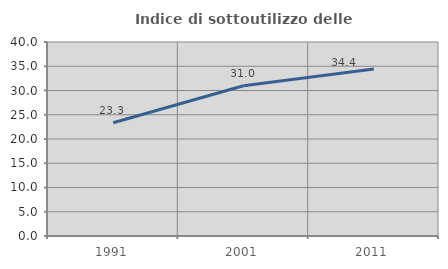
| Category | Indice di sottoutilizzo delle abitazioni  |
|---|---|
| 1991.0 | 23.339 |
| 2001.0 | 30.988 |
| 2011.0 | 34.41 |